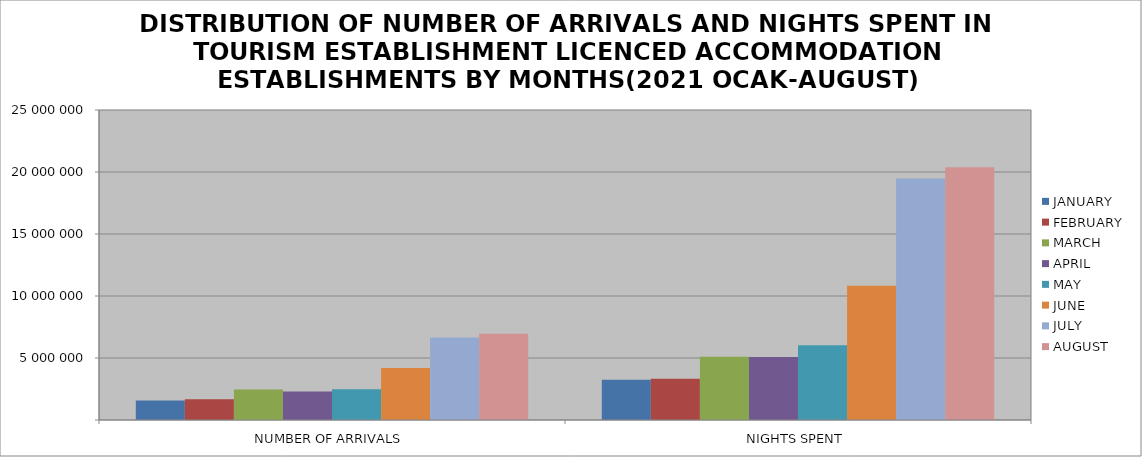
| Category | JANUARY | FEBRUARY | MARCH | APRIL | MAY | JUNE | JULY | AUGUST |
|---|---|---|---|---|---|---|---|---|
| NUMBER OF ARRIVALS | 1571594 | 1670164 | 2462715 | 2305703 | 2480312 | 4203299 | 6647723 | 6953153 |
| NIGHTS SPENT | 3239980 | 3333484 | 5094921 | 5081446 | 6019981 | 10819754 | 19475865 | 20388962 |